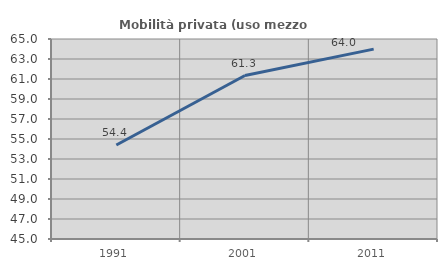
| Category | Mobilità privata (uso mezzo privato) |
|---|---|
| 1991.0 | 54.397 |
| 2001.0 | 61.346 |
| 2011.0 | 63.989 |